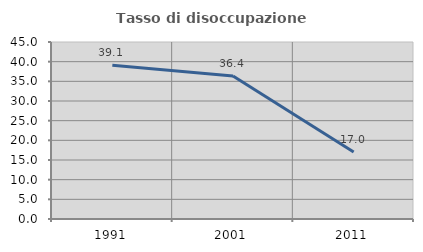
| Category | Tasso di disoccupazione giovanile  |
|---|---|
| 1991.0 | 39.073 |
| 2001.0 | 36.364 |
| 2011.0 | 17.021 |